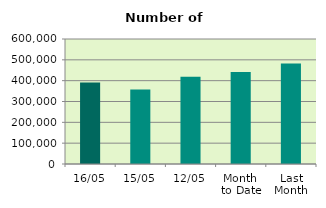
| Category | Series 0 |
|---|---|
| 16/05 | 391674 |
| 15/05 | 357022 |
| 12/05 | 418218 |
| Month 
to Date | 442198.182 |
| Last
Month | 481931.444 |